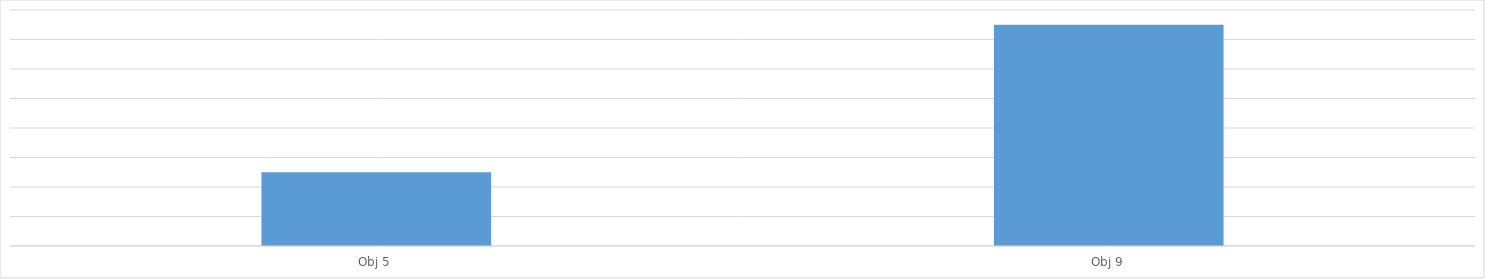
| Category | Total |
|---|---|
| Obj 5 | 1000 |
| Obj 9 | 1100 |